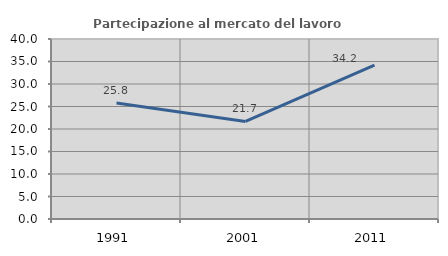
| Category | Partecipazione al mercato del lavoro  femminile |
|---|---|
| 1991.0 | 25.773 |
| 2001.0 | 21.687 |
| 2011.0 | 34.211 |